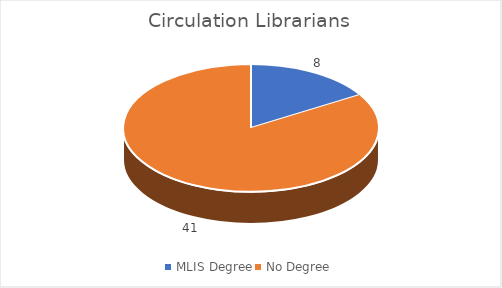
| Category | Series 0 |
|---|---|
| MLIS Degree | 8 |
| No Degree  | 41 |